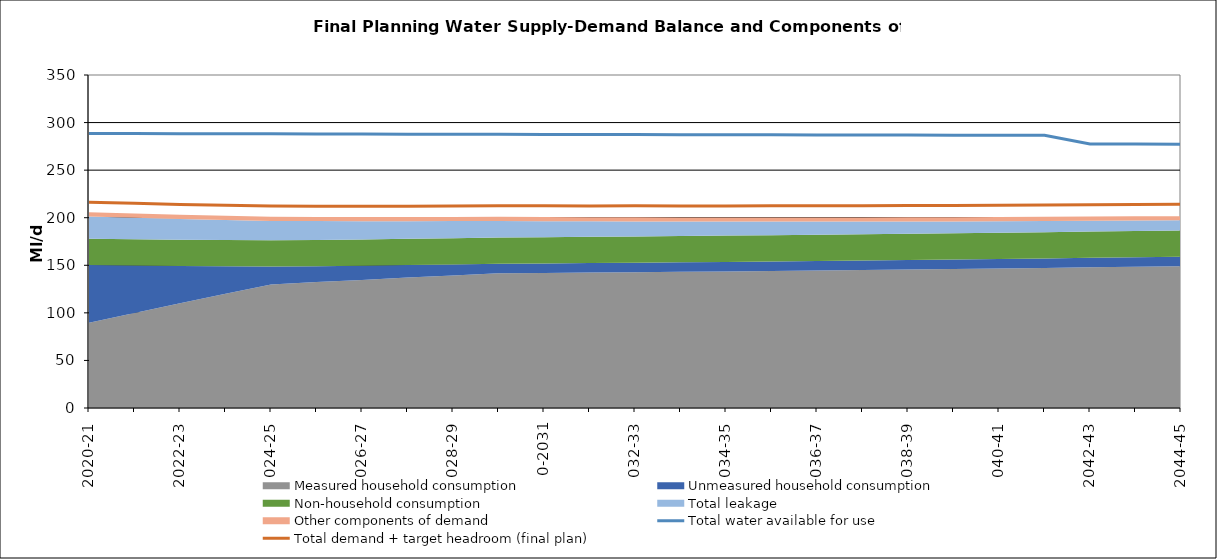
| Category | Total water available for use | Total demand + target headroom (final plan) |
|---|---|---|
| 0 | 288.504 | 216.337 |
| 1 | 288.414 | 215.215 |
| 2 | 288.314 | 213.902 |
| 3 | 288.224 | 213.028 |
| 4 | 288.134 | 212.187 |
| 5 | 288.044 | 212.011 |
| 6 | 287.954 | 212.047 |
| 7 | 287.854 | 212.094 |
| 8 | 287.764 | 212.235 |
| 9 | 287.674 | 212.616 |
| 10 | 287.584 | 212.45 |
| 11 | 287.484 | 212.328 |
| 12 | 287.394 | 212.492 |
| 13 | 287.304 | 212.216 |
| 14 | 287.214 | 212.224 |
| 15 | 287.124 | 212.695 |
| 16 | 287.024 | 212.497 |
| 17 | 286.934 | 212.596 |
| 18 | 286.844 | 212.711 |
| 19 | 286.754 | 212.86 |
| 20 | 286.664 | 213.148 |
| 21 | 286.564 | 213.445 |
| 22 | 277.474 | 213.722 |
| 23 | 277.384 | 213.985 |
| 24 | 277.294 | 214.247 |